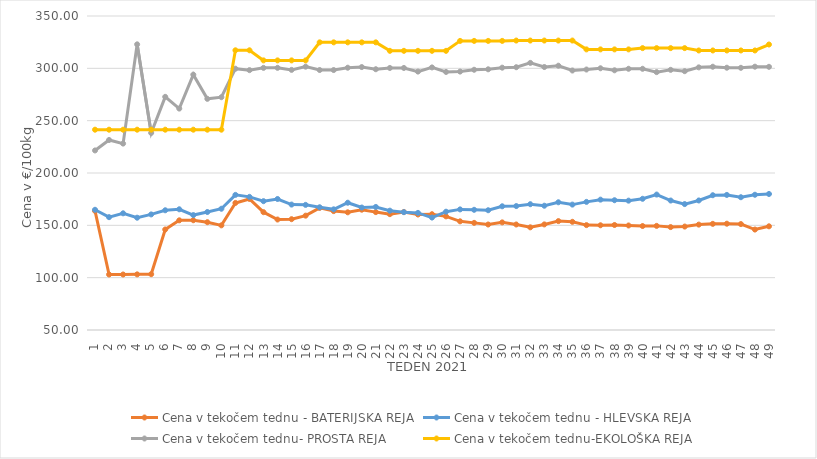
| Category | Cena v tekočem tednu - BATERIJSKA REJA | Cena v tekočem tednu - HLEVSKA REJA | Cena v tekočem tednu- PROSTA REJA | Cena v tekočem tednu-EKOLOŠKA REJA |
|---|---|---|---|---|
| 1.0 | 163.81 | 164.86 | 221.55 | 241.38 |
| 2.0 | 103.02 | 157.81 | 231.55 | 241.38 |
| 3.0 | 103.03 | 161.48 | 228.1 | 241.38 |
| 4.0 | 103.15 | 157.29 | 322.93 | 241.38 |
| 5.0 | 103.34 | 160.43 | 238.28 | 241.38 |
| 6.0 | 146.03 | 164.39 | 272.76 | 241.38 |
| 7.0 | 154.77 | 165.34 | 261.55 | 241.38 |
| 8.0 | 154.86 | 159.79 | 293.97 | 241.38 |
| 9.0 | 153 | 162.73 | 270.86 | 241.38 |
| 10.0 | 149.98 | 165.85 | 272.41 | 241.38 |
| 11.0 | 171.4 | 179.09 | 299.66 | 317.24 |
| 12.0 | 175.2 | 177.21 | 298.27 | 317.24 |
| 13.0 | 162.57 | 173.07 | 300.45 | 307.59 |
| 14.0 | 155.55 | 175.17 | 300.49 | 307.59 |
| 15.0 | 155.88 | 169.83 | 298.52 | 307.59 |
| 16.0 | 159.26 | 169.55 | 301.6 | 307.59 |
| 17.0 | 166.66 | 167.25 | 298.38 | 324.83 |
| 18.0 | 163.58 | 165.28 | 298.35 | 324.83 |
| 19.0 | 162.44 | 171.6 | 300.59 | 324.83 |
| 20.0 | 164.94 | 167.01 | 301.21 | 324.83 |
| 21.0 | 162.64 | 167.56 | 299.14 | 324.83 |
| 22.0 | 160.68 | 164.01 | 300.34 | 316.72 |
| 23.0 | 162.75 | 162.58 | 300.35 | 316.72 |
| 24.0 | 160.34 | 161.89 | 296.9 | 316.72 |
| 25.0 | 160.61 | 157.42 | 300.86 | 316.72 |
| 26.0 | 158.57 | 163.03 | 296.55 | 316.72 |
| 27.0 | 153.83 | 165.23 | 296.9 | 326.21 |
| 28.0 | 152.35 | 164.83 | 298.63 | 326.21 |
| 29.0 | 150.79 | 164.42 | 299.08 | 326.21 |
| 30.0 | 152.82 | 168.2 | 300.63 | 326.21 |
| 31.0 | 150.8 | 168.4 | 301.07 | 326.55 |
| 32.0 | 148.1 | 170.19 | 305.2 | 326.55 |
| 33.0 | 150.88 | 168.74 | 301.25 | 326.55 |
| 34.0 | 154.04 | 172.03 | 302.51 | 326.55 |
| 35.0 | 153.37 | 169.81 | 297.92 | 326.55 |
| 36.0 | 150.21 | 172.4 | 298.86 | 318.1 |
| 37.0 | 150.06 | 174.54 | 300.07 | 318.1 |
| 38.0 | 150.32 | 173.99 | 298.12 | 318.1 |
| 39.0 | 149.86 | 173.58 | 299.58 | 318.1 |
| 40.0 | 149.34 | 175.36 | 299.56 | 319.31 |
| 41.0 | 149.48 | 179.4 | 296.38 | 319.31 |
| 42.0 | 148.32 | 173.69 | 298.56 | 319.31 |
| 43.0 | 148.83 | 170.3 | 297.28 | 319.31 |
| 44.0 | 150.69 | 173.75 | 300.93 | 317.07 |
| 45.0 | 151.41 | 178.77 | 301.53 | 317.07 |
| 46.0 | 151.56 | 179.05 | 300.59 | 317.07 |
| 47.0 | 151.2 | 176.86 | 300.49 | 317.07 |
| 48.0 | 145.97 | 179.22 | 301.57 | 317.07 |
| 49.0 | 149.07 | 179.96 | 301.45 | 322.76 |